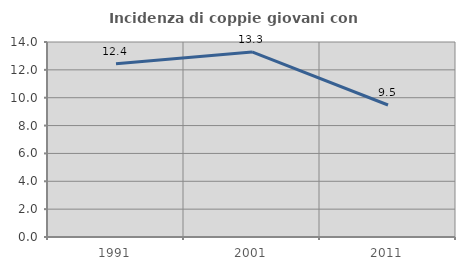
| Category | Incidenza di coppie giovani con figli |
|---|---|
| 1991.0 | 12.44 |
| 2001.0 | 13.285 |
| 2011.0 | 9.476 |